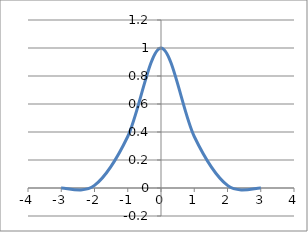
| Category | Series 0 |
|---|---|
| -3.0 | 0 |
| -2.0 | 0.018 |
| -1.0 | 0.368 |
| 0.0 | 1 |
| 1.0 | 0.368 |
| 2.0 | 0.018 |
| 3.0 | 0 |